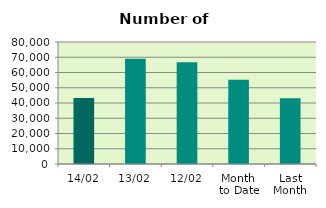
| Category | Series 0 |
|---|---|
| 14/02 | 43290 |
| 13/02 | 68962 |
| 12/02 | 66802 |
| Month 
to Date | 55222.2 |
| Last
Month | 43047.455 |